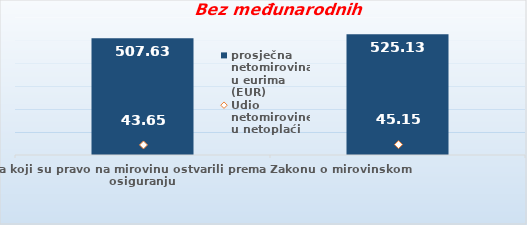
| Category | prosječna netomirovina u eurima (EUR) |
|---|---|
| Korisnici mirovina koji su pravo na mirovinu ostvarili prema Zakonu o mirovinskom osiguranju  | 507.63 |
| Korisnici koji su pravo na mirovinu PRVI PUT ostvarili u 2023. godini prema Zakonu o mirovinskom osiguranju - NOVI KORISNICI | 525.131 |